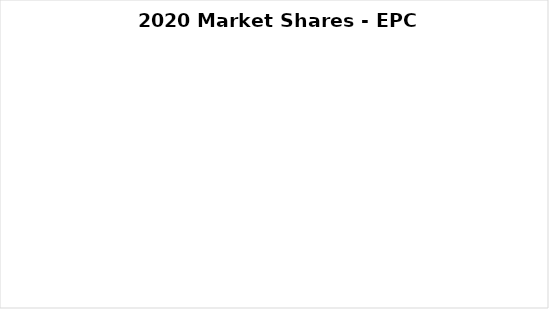
| Category | Series 0 |
|---|---|
| Cisco | 0 |
| Ericsson | 0 |
| Huawei | 0 |
| Mavenir | 0 |
| Nokia | 0 |
| Samsung | 0 |
| ZTE | 0 |
| Other | 0 |